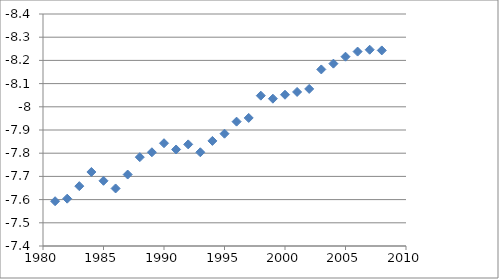
| Category | Series 0 |
|---|---|
| 1981.0 | -7.593 |
| 1982.0 | -7.604 |
| 1983.0 | -7.658 |
| 1984.0 | -7.719 |
| 1985.0 | -7.681 |
| 1986.0 | -7.648 |
| 1987.0 | -7.708 |
| 1988.0 | -7.783 |
| 1989.0 | -7.804 |
| 1990.0 | -7.843 |
| 1991.0 | -7.816 |
| 1992.0 | -7.838 |
| 1993.0 | -7.804 |
| 1994.0 | -7.853 |
| 1995.0 | -7.884 |
| 1996.0 | -7.936 |
| 1997.0 | -7.952 |
| 1998.0 | -8.048 |
| 1999.0 | -8.035 |
| 2000.0 | -8.052 |
| 2001.0 | -8.064 |
| 2002.0 | -8.077 |
| 2003.0 | -8.161 |
| 2004.0 | -8.186 |
| 2005.0 | -8.216 |
| 2006.0 | -8.238 |
| 2007.0 | -8.246 |
| 2008.0 | -8.243 |